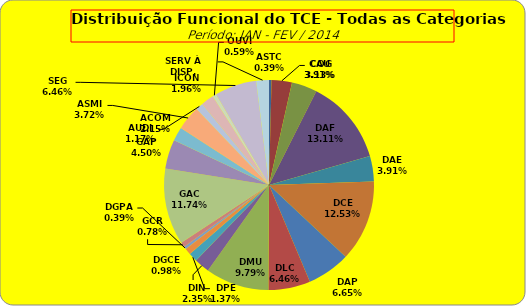
| Category | ASTC COG CAU DAF DAE DCE DAP DLC DMU DIN DPE DGCE DGPA GCR GAC GAP ACOM ASMI AUDI ICON OUVI SEG SERV À DISP. |
|---|---|
| ASTC | 2 |
| COG | 16 |
| CAU | 20 |
| DAF | 67 |
| DAE | 20 |
| DCE | 64 |
| DAP | 34 |
| DLC | 33 |
| DMU | 50 |
| DIN | 12 |
| DPE | 7 |
| DGCE | 5 |
| DGPA | 2 |
| GCR | 4 |
| GAC | 60 |
| GAP | 23 |
| ACOM | 11 |
| ASMI | 19 |
| AUDI | 6 |
| ICON | 10 |
| OUVI | 3 |
| SEG | 33 |
| SERV À DISP. | 10 |